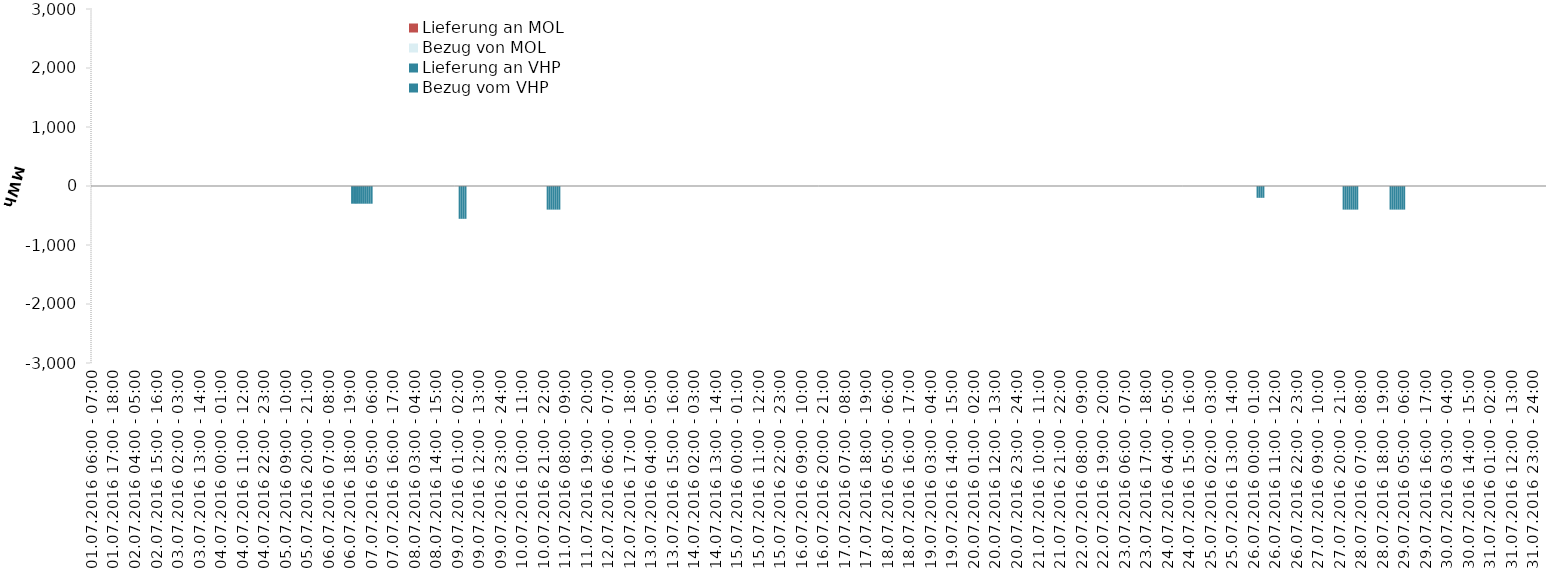
| Category | Bezug vom VHP | Lieferung an VHP | Bezug von MOL | Lieferung an MOL |
|---|---|---|---|---|
| 01.07.2016 06:00 - 07:00 | 0 | 0 | 0 | 0 |
| 01.07.2016 07:00 - 08:00 | 0 | 0 | 0 | 0 |
| 01.07.2016 08:00 - 09:00 | 0 | 0 | 0 | 0 |
| 01.07.2016 09:00 - 10:00 | 0 | 0 | 0 | 0 |
| 01.07.2016 10:00 - 11:00 | 0 | 0 | 0 | 0 |
| 01.07.2016 11:00 - 12:00 | 0 | 0 | 0 | 0 |
| 01.07.2016 12:00 - 13:00 | 0 | 0 | 0 | 0 |
| 01.07.2016 13:00 - 14:00 | 0 | 0 | 0 | 0 |
| 01.07.2016 14:00 - 15:00 | 0 | 0 | 0 | 0 |
| 01.07.2016 15:00 - 16:00 | 0 | 0 | 0 | 0 |
| 01.07.2016 16:00 - 17:00 | 0 | 0 | 0 | 0 |
| 01.07.2016 17:00 - 18:00 | 0 | 0 | 0 | 0 |
| 01.07.2016 18:00 - 19:00 | 0 | 0 | 0 | 0 |
| 01.07.2016 19:00 - 20:00 | 0 | 0 | 0 | 0 |
| 01.07.2016 20:00 - 21:00 | 0 | 0 | 0 | 0 |
| 01.07.2016 21:00 - 22:00 | 0 | 0 | 0 | 0 |
| 01.07.2016 22:00 - 23:00 | 0 | 0 | 0 | 0 |
| 01.07.2016 23:00 - 24:00 | 0 | 0 | 0 | 0 |
| 02.07.2016 00:00 - 01:00 | 0 | 0 | 0 | 0 |
| 02.07.2016 01:00 - 02:00 | 0 | 0 | 0 | 0 |
| 02.07.2016 02:00 - 03:00 | 0 | 0 | 0 | 0 |
| 02.07.2016 03:00 - 04:00 | 0 | 0 | 0 | 0 |
| 02.07.2016 04:00 - 05:00 | 0 | 0 | 0 | 0 |
| 02.07.2016 05:00 - 06:00 | 0 | 0 | 0 | 0 |
| 02.07.2016 06:00 - 07:00 | 0 | 0 | 0 | 0 |
| 02.07.2016 07:00 - 08:00 | 0 | 0 | 0 | 0 |
| 02.07.2016 08:00 - 09:00 | 0 | 0 | 0 | 0 |
| 02.07.2016 09:00 - 10:00 | 0 | 0 | 0 | 0 |
| 02.07.2016 10:00 - 11:00 | 0 | 0 | 0 | 0 |
| 02.07.2016 11:00 - 12:00 | 0 | 0 | 0 | 0 |
| 02.07.2016 12:00 - 13:00 | 0 | 0 | 0 | 0 |
| 02.07.2016 13:00 - 14:00 | 0 | 0 | 0 | 0 |
| 02.07.2016 14:00 - 15:00 | 0 | 0 | 0 | 0 |
| 02.07.2016 15:00 - 16:00 | 0 | 0 | 0 | 0 |
| 02.07.2016 16:00 - 17:00 | 0 | 0 | 0 | 0 |
| 02.07.2016 17:00 - 18:00 | 0 | 0 | 0 | 0 |
| 02.07.2016 18:00 - 19:00 | 0 | 0 | 0 | 0 |
| 02.07.2016 19:00 - 20:00 | 0 | 0 | 0 | 0 |
| 02.07.2016 20:00 - 21:00 | 0 | 0 | 0 | 0 |
| 02.07.2016 21:00 - 22:00 | 0 | 0 | 0 | 0 |
| 02.07.2016 22:00 - 23:00 | 0 | 0 | 0 | 0 |
| 02.07.2016 23:00 - 24:00 | 0 | 0 | 0 | 0 |
| 03.07.2016 00:00 - 01:00 | 0 | 0 | 0 | 0 |
| 03.07.2016 01:00 - 02:00 | 0 | 0 | 0 | 0 |
| 03.07.2016 02:00 - 03:00 | 0 | 0 | 0 | 0 |
| 03.07.2016 03:00 - 04:00 | 0 | 0 | 0 | 0 |
| 03.07.2016 04:00 - 05:00 | 0 | 0 | 0 | 0 |
| 03.07.2016 05:00 - 06:00 | 0 | 0 | 0 | 0 |
| 03.07.2016 06:00 - 07:00 | 0 | 0 | 0 | 0 |
| 03.07.2016 07:00 - 08:00 | 0 | 0 | 0 | 0 |
| 03.07.2016 08:00 - 09:00 | 0 | 0 | 0 | 0 |
| 03.07.2016 09:00 - 10:00 | 0 | 0 | 0 | 0 |
| 03.07.2016 10:00 - 11:00 | 0 | 0 | 0 | 0 |
| 03.07.2016 11:00 - 12:00 | 0 | 0 | 0 | 0 |
| 03.07.2016 12:00 - 13:00 | 0 | 0 | 0 | 0 |
| 03.07.2016 13:00 - 14:00 | 0 | 0 | 0 | 0 |
| 03.07.2016 14:00 - 15:00 | 0 | 0 | 0 | 0 |
| 03.07.2016 15:00 - 16:00 | 0 | 0 | 0 | 0 |
| 03.07.2016 16:00 - 17:00 | 0 | 0 | 0 | 0 |
| 03.07.2016 17:00 - 18:00 | 0 | 0 | 0 | 0 |
| 03.07.2016 18:00 - 19:00 | 0 | 0 | 0 | 0 |
| 03.07.2016 19:00 - 20:00 | 0 | 0 | 0 | 0 |
| 03.07.2016 20:00 - 21:00 | 0 | 0 | 0 | 0 |
| 03.07.2016 21:00 - 22:00 | 0 | 0 | 0 | 0 |
| 03.07.2016 22:00 - 23:00 | 0 | 0 | 0 | 0 |
| 03.07.2016 23:00 - 24:00 | 0 | 0 | 0 | 0 |
| 04.07.2016 00:00 - 01:00 | 0 | 0 | 0 | 0 |
| 04.07.2016 01:00 - 02:00 | 0 | 0 | 0 | 0 |
| 04.07.2016 02:00 - 03:00 | 0 | 0 | 0 | 0 |
| 04.07.2016 03:00 - 04:00 | 0 | 0 | 0 | 0 |
| 04.07.2016 04:00 - 05:00 | 0 | 0 | 0 | 0 |
| 04.07.2016 05:00 - 06:00 | 0 | 0 | 0 | 0 |
| 04.07.2016 06:00 - 07:00 | 0 | 0 | 0 | 0 |
| 04.07.2016 07:00 - 08:00 | 0 | 0 | 0 | 0 |
| 04.07.2016 08:00 - 09:00 | 0 | 0 | 0 | 0 |
| 04.07.2016 09:00 - 10:00 | 0 | 0 | 0 | 0 |
| 04.07.2016 10:00 - 11:00 | 0 | 0 | 0 | 0 |
| 04.07.2016 11:00 - 12:00 | 0 | 0 | 0 | 0 |
| 04.07.2016 12:00 - 13:00 | 0 | 0 | 0 | 0 |
| 04.07.2016 13:00 - 14:00 | 0 | 0 | 0 | 0 |
| 04.07.2016 14:00 - 15:00 | 0 | 0 | 0 | 0 |
| 04.07.2016 15:00 - 16:00 | 0 | 0 | 0 | 0 |
| 04.07.2016 16:00 - 17:00 | 0 | 0 | 0 | 0 |
| 04.07.2016 17:00 - 18:00 | 0 | 0 | 0 | 0 |
| 04.07.2016 18:00 - 19:00 | 0 | 0 | 0 | 0 |
| 04.07.2016 19:00 - 20:00 | 0 | 0 | 0 | 0 |
| 04.07.2016 20:00 - 21:00 | 0 | 0 | 0 | 0 |
| 04.07.2016 21:00 - 22:00 | 0 | 0 | 0 | 0 |
| 04.07.2016 22:00 - 23:00 | 0 | 0 | 0 | 0 |
| 04.07.2016 23:00 - 24:00 | 0 | 0 | 0 | 0 |
| 05.07.2016 00:00 - 01:00 | 0 | 0 | 0 | 0 |
| 05.07.2016 01:00 - 02:00 | 0 | 0 | 0 | 0 |
| 05.07.2016 02:00 - 03:00 | 0 | 0 | 0 | 0 |
| 05.07.2016 03:00 - 04:00 | 0 | 0 | 0 | 0 |
| 05.07.2016 04:00 - 05:00 | 0 | 0 | 0 | 0 |
| 05.07.2016 05:00 - 06:00 | 0 | 0 | 0 | 0 |
| 05.07.2016 06:00 - 07:00 | 0 | 0 | 0 | 0 |
| 05.07.2016 07:00 - 08:00 | 0 | 0 | 0 | 0 |
| 05.07.2016 08:00 - 09:00 | 0 | 0 | 0 | 0 |
| 05.07.2016 09:00 - 10:00 | 0 | 0 | 0 | 0 |
| 05.07.2016 10:00 - 11:00 | 0 | 0 | 0 | 0 |
| 05.07.2016 11:00 - 12:00 | 0 | 0 | 0 | 0 |
| 05.07.2016 12:00 - 13:00 | 0 | 0 | 0 | 0 |
| 05.07.2016 13:00 - 14:00 | 0 | 0 | 0 | 0 |
| 05.07.2016 14:00 - 15:00 | 0 | 0 | 0 | 0 |
| 05.07.2016 15:00 - 16:00 | 0 | 0 | 0 | 0 |
| 05.07.2016 16:00 - 17:00 | 0 | 0 | 0 | 0 |
| 05.07.2016 17:00 - 18:00 | 0 | 0 | 0 | 0 |
| 05.07.2016 18:00 - 19:00 | 0 | 0 | 0 | 0 |
| 05.07.2016 19:00 - 20:00 | 0 | 0 | 0 | 0 |
| 05.07.2016 20:00 - 21:00 | 0 | 0 | 0 | 0 |
| 05.07.2016 21:00 - 22:00 | 0 | 0 | 0 | 0 |
| 05.07.2016 22:00 - 23:00 | 0 | 0 | 0 | 0 |
| 05.07.2016 23:00 - 24:00 | 0 | 0 | 0 | 0 |
| 06.07.2016 00:00 - 01:00 | 0 | 0 | 0 | 0 |
| 06.07.2016 01:00 - 02:00 | 0 | 0 | 0 | 0 |
| 06.07.2016 02:00 - 03:00 | 0 | 0 | 0 | 0 |
| 06.07.2016 03:00 - 04:00 | 0 | 0 | 0 | 0 |
| 06.07.2016 04:00 - 05:00 | 0 | 0 | 0 | 0 |
| 06.07.2016 05:00 - 06:00 | 0 | 0 | 0 | 0 |
| 06.07.2016 06:00 - 07:00 | 0 | 0 | 0 | 0 |
| 06.07.2016 07:00 - 08:00 | 0 | 0 | 0 | 0 |
| 06.07.2016 08:00 - 09:00 | 0 | 0 | 0 | 0 |
| 06.07.2016 09:00 - 10:00 | 0 | 0 | 0 | 0 |
| 06.07.2016 10:00 - 11:00 | 0 | 0 | 0 | 0 |
| 06.07.2016 11:00 - 12:00 | 0 | 0 | 0 | 0 |
| 06.07.2016 12:00 - 13:00 | 0 | 0 | 0 | 0 |
| 06.07.2016 13:00 - 14:00 | 0 | 0 | 0 | 0 |
| 06.07.2016 14:00 - 15:00 | 0 | 0 | 0 | 0 |
| 06.07.2016 15:00 - 16:00 | 0 | 0 | 0 | 0 |
| 06.07.2016 16:00 - 17:00 | 0 | 0 | 0 | 0 |
| 06.07.2016 17:00 - 18:00 | 0 | 0 | 0 | 0 |
| 06.07.2016 18:00 - 19:00 | 0 | 0 | 0 | 0 |
| 06.07.2016 19:00 - 20:00 | 0 | -300 | 0 | 0 |
| 06.07.2016 20:00 - 21:00 | 0 | -300 | 0 | 0 |
| 06.07.2016 21:00 - 22:00 | 0 | -300 | 0 | 0 |
| 06.07.2016 22:00 - 23:00 | 0 | -300 | 0 | 0 |
| 06.07.2016 23:00 - 24:00 | 0 | -300 | 0 | 0 |
| 07.07.2016 00:00 - 01:00 | 0 | -300 | 0 | 0 |
| 07.07.2016 01:00 - 02:00 | 0 | -300 | 0 | 0 |
| 07.07.2016 02:00 - 03:00 | 0 | -300 | 0 | 0 |
| 07.07.2016 03:00 - 04:00 | 0 | -300 | 0 | 0 |
| 07.07.2016 04:00 - 05:00 | 0 | -300 | 0 | 0 |
| 07.07.2016 05:00 - 06:00 | 0 | -300 | 0 | 0 |
| 07.07.2016 06:00 - 07:00 | 0 | 0 | 0 | 0 |
| 07.07.2016 07:00 - 08:00 | 0 | 0 | 0 | 0 |
| 07.07.2016 08:00 - 09:00 | 0 | 0 | 0 | 0 |
| 07.07.2016 09:00 - 10:00 | 0 | 0 | 0 | 0 |
| 07.07.2016 10:00 - 11:00 | 0 | 0 | 0 | 0 |
| 07.07.2016 11:00 - 12:00 | 0 | 0 | 0 | 0 |
| 07.07.2016 12:00 - 13:00 | 0 | 0 | 0 | 0 |
| 07.07.2016 13:00 - 14:00 | 0 | 0 | 0 | 0 |
| 07.07.2016 14:00 - 15:00 | 0 | 0 | 0 | 0 |
| 07.07.2016 15:00 - 16:00 | 0 | 0 | 0 | 0 |
| 07.07.2016 16:00 - 17:00 | 0 | 0 | 0 | 0 |
| 07.07.2016 17:00 - 18:00 | 0 | 0 | 0 | 0 |
| 07.07.2016 18:00 - 19:00 | 0 | 0 | 0 | 0 |
| 07.07.2016 19:00 - 20:00 | 0 | 0 | 0 | 0 |
| 07.07.2016 20:00 - 21:00 | 0 | 0 | 0 | 0 |
| 07.07.2016 21:00 - 22:00 | 0 | 0 | 0 | 0 |
| 07.07.2016 22:00 - 23:00 | 0 | 0 | 0 | 0 |
| 07.07.2016 23:00 - 24:00 | 0 | 0 | 0 | 0 |
| 08.07.2016 00:00 - 01:00 | 0 | 0 | 0 | 0 |
| 08.07.2016 01:00 - 02:00 | 0 | 0 | 0 | 0 |
| 08.07.2016 02:00 - 03:00 | 0 | 0 | 0 | 0 |
| 08.07.2016 03:00 - 04:00 | 0 | 0 | 0 | 0 |
| 08.07.2016 04:00 - 05:00 | 0 | 0 | 0 | 0 |
| 08.07.2016 05:00 - 06:00 | 0 | 0 | 0 | 0 |
| 08.07.2016 06:00 - 07:00 | 0 | 0 | 0 | 0 |
| 08.07.2016 07:00 - 08:00 | 0 | 0 | 0 | 0 |
| 08.07.2016 08:00 - 09:00 | 0 | 0 | 0 | 0 |
| 08.07.2016 09:00 - 10:00 | 0 | 0 | 0 | 0 |
| 08.07.2016 10:00 - 11:00 | 0 | 0 | 0 | 0 |
| 08.07.2016 11:00 - 12:00 | 0 | 0 | 0 | 0 |
| 08.07.2016 12:00 - 13:00 | 0 | 0 | 0 | 0 |
| 08.07.2016 13:00 - 14:00 | 0 | 0 | 0 | 0 |
| 08.07.2016 14:00 - 15:00 | 0 | 0 | 0 | 0 |
| 08.07.2016 15:00 - 16:00 | 0 | 0 | 0 | 0 |
| 08.07.2016 16:00 - 17:00 | 0 | 0 | 0 | 0 |
| 08.07.2016 17:00 - 18:00 | 0 | 0 | 0 | 0 |
| 08.07.2016 18:00 - 19:00 | 0 | 0 | 0 | 0 |
| 08.07.2016 19:00 - 20:00 | 0 | 0 | 0 | 0 |
| 08.07.2016 20:00 - 21:00 | 0 | 0 | 0 | 0 |
| 08.07.2016 21:00 - 22:00 | 0 | 0 | 0 | 0 |
| 08.07.2016 22:00 - 23:00 | 0 | 0 | 0 | 0 |
| 08.07.2016 23:00 - 24:00 | 0 | 0 | 0 | 0 |
| 09.07.2016 00:00 - 01:00 | 0 | 0 | 0 | 0 |
| 09.07.2016 01:00 - 02:00 | 0 | 0 | 0 | 0 |
| 09.07.2016 02:00 - 03:00 | 0 | -556 | 0 | 0 |
| 09.07.2016 03:00 - 04:00 | 0 | -556 | 0 | 0 |
| 09.07.2016 04:00 - 05:00 | 0 | -556 | 0 | 0 |
| 09.07.2016 05:00 - 06:00 | 0 | -556 | 0 | 0 |
| 09.07.2016 06:00 - 07:00 | 0 | 0 | 0 | 0 |
| 09.07.2016 07:00 - 08:00 | 0 | 0 | 0 | 0 |
| 09.07.2016 08:00 - 09:00 | 0 | 0 | 0 | 0 |
| 09.07.2016 09:00 - 10:00 | 0 | 0 | 0 | 0 |
| 09.07.2016 10:00 - 11:00 | 0 | 0 | 0 | 0 |
| 09.07.2016 11:00 - 12:00 | 0 | 0 | 0 | 0 |
| 09.07.2016 12:00 - 13:00 | 0 | 0 | 0 | 0 |
| 09.07.2016 13:00 - 14:00 | 0 | 0 | 0 | 0 |
| 09.07.2016 14:00 - 15:00 | 0 | 0 | 0 | 0 |
| 09.07.2016 15:00 - 16:00 | 0 | 0 | 0 | 0 |
| 09.07.2016 16:00 - 17:00 | 0 | 0 | 0 | 0 |
| 09.07.2016 17:00 - 18:00 | 0 | 0 | 0 | 0 |
| 09.07.2016 18:00 - 19:00 | 0 | 0 | 0 | 0 |
| 09.07.2016 19:00 - 20:00 | 0 | 0 | 0 | 0 |
| 09.07.2016 20:00 - 21:00 | 0 | 0 | 0 | 0 |
| 09.07.2016 21:00 - 22:00 | 0 | 0 | 0 | 0 |
| 09.07.2016 22:00 - 23:00 | 0 | 0 | 0 | 0 |
| 09.07.2016 23:00 - 24:00 | 0 | 0 | 0 | 0 |
| 10.07.2016 00:00 - 01:00 | 0 | 0 | 0 | 0 |
| 10.07.2016 01:00 - 02:00 | 0 | 0 | 0 | 0 |
| 10.07.2016 02:00 - 03:00 | 0 | 0 | 0 | 0 |
| 10.07.2016 03:00 - 04:00 | 0 | 0 | 0 | 0 |
| 10.07.2016 04:00 - 05:00 | 0 | 0 | 0 | 0 |
| 10.07.2016 05:00 - 06:00 | 0 | 0 | 0 | 0 |
| 10.07.2016 06:00 - 07:00 | 0 | 0 | 0 | 0 |
| 10.07.2016 07:00 - 08:00 | 0 | 0 | 0 | 0 |
| 10.07.2016 08:00 - 09:00 | 0 | 0 | 0 | 0 |
| 10.07.2016 09:00 - 10:00 | 0 | 0 | 0 | 0 |
| 10.07.2016 10:00 - 11:00 | 0 | 0 | 0 | 0 |
| 10.07.2016 11:00 - 12:00 | 0 | 0 | 0 | 0 |
| 10.07.2016 12:00 - 13:00 | 0 | 0 | 0 | 0 |
| 10.07.2016 13:00 - 14:00 | 0 | 0 | 0 | 0 |
| 10.07.2016 14:00 - 15:00 | 0 | 0 | 0 | 0 |
| 10.07.2016 15:00 - 16:00 | 0 | 0 | 0 | 0 |
| 10.07.2016 16:00 - 17:00 | 0 | 0 | 0 | 0 |
| 10.07.2016 17:00 - 18:00 | 0 | 0 | 0 | 0 |
| 10.07.2016 18:00 - 19:00 | 0 | 0 | 0 | 0 |
| 10.07.2016 19:00 - 20:00 | 0 | 0 | 0 | 0 |
| 10.07.2016 20:00 - 21:00 | 0 | 0 | 0 | 0 |
| 10.07.2016 21:00 - 22:00 | 0 | 0 | 0 | 0 |
| 10.07.2016 22:00 - 23:00 | 0 | 0 | 0 | 0 |
| 10.07.2016 23:00 - 24:00 | 0 | -400 | 0 | 0 |
| 11.07.2016 00:00 - 01:00 | 0 | -400 | 0 | 0 |
| 11.07.2016 01:00 - 02:00 | 0 | -400 | 0 | 0 |
| 11.07.2016 02:00 - 03:00 | 0 | -400 | 0 | 0 |
| 11.07.2016 03:00 - 04:00 | 0 | -400 | 0 | 0 |
| 11.07.2016 04:00 - 05:00 | 0 | -400 | 0 | 0 |
| 11.07.2016 05:00 - 06:00 | 0 | -400 | 0 | 0 |
| 11.07.2016 06:00 - 07:00 | 0 | 0 | 0 | 0 |
| 11.07.2016 07:00 - 08:00 | 0 | 0 | 0 | 0 |
| 11.07.2016 08:00 - 09:00 | 0 | 0 | 0 | 0 |
| 11.07.2016 09:00 - 10:00 | 0 | 0 | 0 | 0 |
| 11.07.2016 10:00 - 11:00 | 0 | 0 | 0 | 0 |
| 11.07.2016 11:00 - 12:00 | 0 | 0 | 0 | 0 |
| 11.07.2016 12:00 - 13:00 | 0 | 0 | 0 | 0 |
| 11.07.2016 13:00 - 14:00 | 0 | 0 | 0 | 0 |
| 11.07.2016 14:00 - 15:00 | 0 | 0 | 0 | 0 |
| 11.07.2016 15:00 - 16:00 | 0 | 0 | 0 | 0 |
| 11.07.2016 16:00 - 17:00 | 0 | 0 | 0 | 0 |
| 11.07.2016 17:00 - 18:00 | 0 | 0 | 0 | 0 |
| 11.07.2016 18:00 - 19:00 | 0 | 0 | 0 | 0 |
| 11.07.2016 19:00 - 20:00 | 0 | 0 | 0 | 0 |
| 11.07.2016 20:00 - 21:00 | 0 | 0 | 0 | 0 |
| 11.07.2016 21:00 - 22:00 | 0 | 0 | 0 | 0 |
| 11.07.2016 22:00 - 23:00 | 0 | 0 | 0 | 0 |
| 11.07.2016 23:00 - 24:00 | 0 | 0 | 0 | 0 |
| 12.07.2016 00:00 - 01:00 | 0 | 0 | 0 | 0 |
| 12.07.2016 01:00 - 02:00 | 0 | 0 | 0 | 0 |
| 12.07.2016 02:00 - 03:00 | 0 | 0 | 0 | 0 |
| 12.07.2016 03:00 - 04:00 | 0 | 0 | 0 | 0 |
| 12.07.2016 04:00 - 05:00 | 0 | 0 | 0 | 0 |
| 12.07.2016 05:00 - 06:00 | 0 | 0 | 0 | 0 |
| 12.07.2016 06:00 - 07:00 | 0 | 0 | 0 | 0 |
| 12.07.2016 07:00 - 08:00 | 0 | 0 | 0 | 0 |
| 12.07.2016 08:00 - 09:00 | 0 | 0 | 0 | 0 |
| 12.07.2016 09:00 - 10:00 | 0 | 0 | 0 | 0 |
| 12.07.2016 10:00 - 11:00 | 0 | 0 | 0 | 0 |
| 12.07.2016 11:00 - 12:00 | 0 | 0 | 0 | 0 |
| 12.07.2016 12:00 - 13:00 | 0 | 0 | 0 | 0 |
| 12.07.2016 13:00 - 14:00 | 0 | 0 | 0 | 0 |
| 12.07.2016 14:00 - 15:00 | 0 | 0 | 0 | 0 |
| 12.07.2016 15:00 - 16:00 | 0 | 0 | 0 | 0 |
| 12.07.2016 16:00 - 17:00 | 0 | 0 | 0 | 0 |
| 12.07.2016 17:00 - 18:00 | 0 | 0 | 0 | 0 |
| 12.07.2016 18:00 - 19:00 | 0 | 0 | 0 | 0 |
| 12.07.2016 19:00 - 20:00 | 0 | 0 | 0 | 0 |
| 12.07.2016 20:00 - 21:00 | 0 | 0 | 0 | 0 |
| 12.07.2016 21:00 - 22:00 | 0 | 0 | 0 | 0 |
| 12.07.2016 22:00 - 23:00 | 0 | 0 | 0 | 0 |
| 12.07.2016 23:00 - 24:00 | 0 | 0 | 0 | 0 |
| 13.07.2016 00:00 - 01:00 | 0 | 0 | 0 | 0 |
| 13.07.2016 01:00 - 02:00 | 0 | 0 | 0 | 0 |
| 13.07.2016 02:00 - 03:00 | 0 | 0 | 0 | 0 |
| 13.07.2016 03:00 - 04:00 | 0 | 0 | 0 | 0 |
| 13.07.2016 04:00 - 05:00 | 0 | 0 | 0 | 0 |
| 13.07.2016 05:00 - 06:00 | 0 | 0 | 0 | 0 |
| 13.07.2016 06:00 - 07:00 | 0 | 0 | 0 | 0 |
| 13.07.2016 07:00 - 08:00 | 0 | 0 | 0 | 0 |
| 13.07.2016 08:00 - 09:00 | 0 | 0 | 0 | 0 |
| 13.07.2016 09:00 - 10:00 | 0 | 0 | 0 | 0 |
| 13.07.2016 10:00 - 11:00 | 0 | 0 | 0 | 0 |
| 13.07.2016 11:00 - 12:00 | 0 | 0 | 0 | 0 |
| 13.07.2016 12:00 - 13:00 | 0 | 0 | 0 | 0 |
| 13.07.2016 13:00 - 14:00 | 0 | 0 | 0 | 0 |
| 13.07.2016 14:00 - 15:00 | 0 | 0 | 0 | 0 |
| 13.07.2016 15:00 - 16:00 | 0 | 0 | 0 | 0 |
| 13.07.2016 16:00 - 17:00 | 0 | 0 | 0 | 0 |
| 13.07.2016 17:00 - 18:00 | 0 | 0 | 0 | 0 |
| 13.07.2016 18:00 - 19:00 | 0 | 0 | 0 | 0 |
| 13.07.2016 19:00 - 20:00 | 0 | 0 | 0 | 0 |
| 13.07.2016 20:00 - 21:00 | 0 | 0 | 0 | 0 |
| 13.07.2016 21:00 - 22:00 | 0 | 0 | 0 | 0 |
| 13.07.2016 22:00 - 23:00 | 0 | 0 | 0 | 0 |
| 13.07.2016 23:00 - 24:00 | 0 | 0 | 0 | 0 |
| 14.07.2016 00:00 - 01:00 | 0 | 0 | 0 | 0 |
| 14.07.2016 01:00 - 02:00 | 0 | 0 | 0 | 0 |
| 14.07.2016 02:00 - 03:00 | 0 | 0 | 0 | 0 |
| 14.07.2016 03:00 - 04:00 | 0 | 0 | 0 | 0 |
| 14.07.2016 04:00 - 05:00 | 0 | 0 | 0 | 0 |
| 14.07.2016 05:00 - 06:00 | 0 | 0 | 0 | 0 |
| 14.07.2016 06:00 - 07:00 | 0 | 0 | 0 | 0 |
| 14.07.2016 07:00 - 08:00 | 0 | 0 | 0 | 0 |
| 14.07.2016 08:00 - 09:00 | 0 | 0 | 0 | 0 |
| 14.07.2016 09:00 - 10:00 | 0 | 0 | 0 | 0 |
| 14.07.2016 10:00 - 11:00 | 0 | 0 | 0 | 0 |
| 14.07.2016 11:00 - 12:00 | 0 | 0 | 0 | 0 |
| 14.07.2016 12:00 - 13:00 | 0 | 0 | 0 | 0 |
| 14.07.2016 13:00 - 14:00 | 0 | 0 | 0 | 0 |
| 14.07.2016 14:00 - 15:00 | 0 | 0 | 0 | 0 |
| 14.07.2016 15:00 - 16:00 | 0 | 0 | 0 | 0 |
| 14.07.2016 16:00 - 17:00 | 0 | 0 | 0 | 0 |
| 14.07.2016 17:00 - 18:00 | 0 | 0 | 0 | 0 |
| 14.07.2016 18:00 - 19:00 | 0 | 0 | 0 | 0 |
| 14.07.2016 19:00 - 20:00 | 0 | 0 | 0 | 0 |
| 14.07.2016 20:00 - 21:00 | 0 | 0 | 0 | 0 |
| 14.07.2016 21:00 - 22:00 | 0 | 0 | 0 | 0 |
| 14.07.2016 22:00 - 23:00 | 0 | 0 | 0 | 0 |
| 14.07.2016 23:00 - 24:00 | 0 | 0 | 0 | 0 |
| 15.07.2016 00:00 - 01:00 | 0 | 0 | 0 | 0 |
| 15.07.2016 01:00 - 02:00 | 0 | 0 | 0 | 0 |
| 15.07.2016 02:00 - 03:00 | 0 | 0 | 0 | 0 |
| 15.07.2016 03:00 - 04:00 | 0 | 0 | 0 | 0 |
| 15.07.2016 04:00 - 05:00 | 0 | 0 | 0 | 0 |
| 15.07.2016 05:00 - 06:00 | 0 | 0 | 0 | 0 |
| 15.07.2016 06:00 - 07:00 | 0 | 0 | 0 | 0 |
| 15.07.2016 07:00 - 08:00 | 0 | 0 | 0 | 0 |
| 15.07.2016 08:00 - 09:00 | 0 | 0 | 0 | 0 |
| 15.07.2016 09:00 - 10:00 | 0 | 0 | 0 | 0 |
| 15.07.2016 10:00 - 11:00 | 0 | 0 | 0 | 0 |
| 15.07.2016 11:00 - 12:00 | 0 | 0 | 0 | 0 |
| 15.07.2016 12:00 - 13:00 | 0 | 0 | 0 | 0 |
| 15.07.2016 13:00 - 14:00 | 0 | 0 | 0 | 0 |
| 15.07.2016 14:00 - 15:00 | 0 | 0 | 0 | 0 |
| 15.07.2016 15:00 - 16:00 | 0 | 0 | 0 | 0 |
| 15.07.2016 16:00 - 17:00 | 0 | 0 | 0 | 0 |
| 15.07.2016 17:00 - 18:00 | 0 | 0 | 0 | 0 |
| 15.07.2016 18:00 - 19:00 | 0 | 0 | 0 | 0 |
| 15.07.2016 19:00 - 20:00 | 0 | 0 | 0 | 0 |
| 15.07.2016 20:00 - 21:00 | 0 | 0 | 0 | 0 |
| 15.07.2016 21:00 - 22:00 | 0 | 0 | 0 | 0 |
| 15.07.2016 22:00 - 23:00 | 0 | 0 | 0 | 0 |
| 15.07.2016 23:00 - 24:00 | 0 | 0 | 0 | 0 |
| 16.07.2016 00:00 - 01:00 | 0 | 0 | 0 | 0 |
| 16.07.2016 01:00 - 02:00 | 0 | 0 | 0 | 0 |
| 16.07.2016 02:00 - 03:00 | 0 | 0 | 0 | 0 |
| 16.07.2016 03:00 - 04:00 | 0 | 0 | 0 | 0 |
| 16.07.2016 04:00 - 05:00 | 0 | 0 | 0 | 0 |
| 16.07.2016 05:00 - 06:00 | 0 | 0 | 0 | 0 |
| 16.07.2016 06:00 - 07:00 | 0 | 0 | 0 | 0 |
| 16.07.2016 07:00 - 08:00 | 0 | 0 | 0 | 0 |
| 16.07.2016 08:00 - 09:00 | 0 | 0 | 0 | 0 |
| 16.07.2016 09:00 - 10:00 | 0 | 0 | 0 | 0 |
| 16.07.2016 10:00 - 11:00 | 0 | 0 | 0 | 0 |
| 16.07.2016 11:00 - 12:00 | 0 | 0 | 0 | 0 |
| 16.07.2016 12:00 - 13:00 | 0 | 0 | 0 | 0 |
| 16.07.2016 13:00 - 14:00 | 0 | 0 | 0 | 0 |
| 16.07.2016 14:00 - 15:00 | 0 | 0 | 0 | 0 |
| 16.07.2016 15:00 - 16:00 | 0 | 0 | 0 | 0 |
| 16.07.2016 16:00 - 17:00 | 0 | 0 | 0 | 0 |
| 16.07.2016 17:00 - 18:00 | 0 | 0 | 0 | 0 |
| 16.07.2016 18:00 - 19:00 | 0 | 0 | 0 | 0 |
| 16.07.2016 19:00 - 20:00 | 0 | 0 | 0 | 0 |
| 16.07.2016 20:00 - 21:00 | 0 | 0 | 0 | 0 |
| 16.07.2016 21:00 - 22:00 | 0 | 0 | 0 | 0 |
| 16.07.2016 22:00 - 23:00 | 0 | 0 | 0 | 0 |
| 16.07.2016 23:00 - 24:00 | 0 | 0 | 0 | 0 |
| 17.07.2016 00:00 - 01:00 | 0 | 0 | 0 | 0 |
| 17.07.2016 01:00 - 02:00 | 0 | 0 | 0 | 0 |
| 17.07.2016 02:00 - 03:00 | 0 | 0 | 0 | 0 |
| 17.07.2016 03:00 - 04:00 | 0 | 0 | 0 | 0 |
| 17.07.2016 04:00 - 05:00 | 0 | 0 | 0 | 0 |
| 17.07.2016 05:00 - 06:00 | 0 | 0 | 0 | 0 |
| 17.07.2016 06:00 - 07:00 | 0 | 0 | 0 | 0 |
| 17.07.2016 07:00 - 08:00 | 0 | 0 | 0 | 0 |
| 17.07.2016 08:00 - 09:00 | 0 | 0 | 0 | 0 |
| 17.07.2016 09:00 - 10:00 | 0 | 0 | 0 | 0 |
| 17.07.2016 10:00 - 11:00 | 0 | 0 | 0 | 0 |
| 17.07.2016 11:00 - 12:00 | 0 | 0 | 0 | 0 |
| 17.07.2016 12:00 - 13:00 | 0 | 0 | 0 | 0 |
| 17.07.2016 13:00 - 14:00 | 0 | 0 | 0 | 0 |
| 17.07.2016 14:00 - 15:00 | 0 | 0 | 0 | 0 |
| 17.07.2016 15:00 - 16:00 | 0 | 0 | 0 | 0 |
| 17.07.2016 16:00 - 17:00 | 0 | 0 | 0 | 0 |
| 17.07.2016 17:00 - 18:00 | 0 | 0 | 0 | 0 |
| 17.07.2016 18:00 - 19:00 | 0 | 0 | 0 | 0 |
| 17.07.2016 19:00 - 20:00 | 0 | 0 | 0 | 0 |
| 17.07.2016 20:00 - 21:00 | 0 | 0 | 0 | 0 |
| 17.07.2016 21:00 - 22:00 | 0 | 0 | 0 | 0 |
| 17.07.2016 22:00 - 23:00 | 0 | 0 | 0 | 0 |
| 17.07.2016 23:00 - 24:00 | 0 | 0 | 0 | 0 |
| 18.07.2016 00:00 - 01:00 | 0 | 0 | 0 | 0 |
| 18.07.2016 01:00 - 02:00 | 0 | 0 | 0 | 0 |
| 18.07.2016 02:00 - 03:00 | 0 | 0 | 0 | 0 |
| 18.07.2016 03:00 - 04:00 | 0 | 0 | 0 | 0 |
| 18.07.2016 04:00 - 05:00 | 0 | 0 | 0 | 0 |
| 18.07.2016 05:00 - 06:00 | 0 | 0 | 0 | 0 |
| 18.07.2016 06:00 - 07:00 | 0 | 0 | 0 | 0 |
| 18.07.2016 07:00 - 08:00 | 0 | 0 | 0 | 0 |
| 18.07.2016 08:00 - 09:00 | 0 | 0 | 0 | 0 |
| 18.07.2016 09:00 - 10:00 | 0 | 0 | 0 | 0 |
| 18.07.2016 10:00 - 11:00 | 0 | 0 | 0 | 0 |
| 18.07.2016 11:00 - 12:00 | 0 | 0 | 0 | 0 |
| 18.07.2016 12:00 - 13:00 | 0 | 0 | 0 | 0 |
| 18.07.2016 13:00 - 14:00 | 0 | 0 | 0 | 0 |
| 18.07.2016 14:00 - 15:00 | 0 | 0 | 0 | 0 |
| 18.07.2016 15:00 - 16:00 | 0 | 0 | 0 | 0 |
| 18.07.2016 16:00 - 17:00 | 0 | 0 | 0 | 0 |
| 18.07.2016 17:00 - 18:00 | 0 | 0 | 0 | 0 |
| 18.07.2016 18:00 - 19:00 | 0 | 0 | 0 | 0 |
| 18.07.2016 19:00 - 20:00 | 0 | 0 | 0 | 0 |
| 18.07.2016 20:00 - 21:00 | 0 | 0 | 0 | 0 |
| 18.07.2016 21:00 - 22:00 | 0 | 0 | 0 | 0 |
| 18.07.2016 22:00 - 23:00 | 0 | 0 | 0 | 0 |
| 18.07.2016 23:00 - 24:00 | 0 | 0 | 0 | 0 |
| 19.07.2016 00:00 - 01:00 | 0 | 0 | 0 | 0 |
| 19.07.2016 01:00 - 02:00 | 0 | 0 | 0 | 0 |
| 19.07.2016 02:00 - 03:00 | 0 | 0 | 0 | 0 |
| 19.07.2016 03:00 - 04:00 | 0 | 0 | 0 | 0 |
| 19.07.2016 04:00 - 05:00 | 0 | 0 | 0 | 0 |
| 19.07.2016 05:00 - 06:00 | 0 | 0 | 0 | 0 |
| 19.07.2016 06:00 - 07:00 | 0 | 0 | 0 | 0 |
| 19.07.2016 07:00 - 08:00 | 0 | 0 | 0 | 0 |
| 19.07.2016 08:00 - 09:00 | 0 | 0 | 0 | 0 |
| 19.07.2016 09:00 - 10:00 | 0 | 0 | 0 | 0 |
| 19.07.2016 10:00 - 11:00 | 0 | 0 | 0 | 0 |
| 19.07.2016 11:00 - 12:00 | 0 | 0 | 0 | 0 |
| 19.07.2016 12:00 - 13:00 | 0 | 0 | 0 | 0 |
| 19.07.2016 13:00 - 14:00 | 0 | 0 | 0 | 0 |
| 19.07.2016 14:00 - 15:00 | 0 | 0 | 0 | 0 |
| 19.07.2016 15:00 - 16:00 | 0 | 0 | 0 | 0 |
| 19.07.2016 16:00 - 17:00 | 0 | 0 | 0 | 0 |
| 19.07.2016 17:00 - 18:00 | 0 | 0 | 0 | 0 |
| 19.07.2016 18:00 - 19:00 | 0 | 0 | 0 | 0 |
| 19.07.2016 19:00 - 20:00 | 0 | 0 | 0 | 0 |
| 19.07.2016 20:00 - 21:00 | 0 | 0 | 0 | 0 |
| 19.07.2016 21:00 - 22:00 | 0 | 0 | 0 | 0 |
| 19.07.2016 22:00 - 23:00 | 0 | 0 | 0 | 0 |
| 19.07.2016 23:00 - 24:00 | 0 | 0 | 0 | 0 |
| 20.07.2016 00:00 - 01:00 | 0 | 0 | 0 | 0 |
| 20.07.2016 01:00 - 02:00 | 0 | 0 | 0 | 0 |
| 20.07.2016 02:00 - 03:00 | 0 | 0 | 0 | 0 |
| 20.07.2016 03:00 - 04:00 | 0 | 0 | 0 | 0 |
| 20.07.2016 04:00 - 05:00 | 0 | 0 | 0 | 0 |
| 20.07.2016 05:00 - 06:00 | 0 | 0 | 0 | 0 |
| 20.07.2016 06:00 - 07:00 | 0 | 0 | 0 | 0 |
| 20.07.2016 07:00 - 08:00 | 0 | 0 | 0 | 0 |
| 20.07.2016 08:00 - 09:00 | 0 | 0 | 0 | 0 |
| 20.07.2016 09:00 - 10:00 | 0 | 0 | 0 | 0 |
| 20.07.2016 10:00 - 11:00 | 0 | 0 | 0 | 0 |
| 20.07.2016 11:00 - 12:00 | 0 | 0 | 0 | 0 |
| 20.07.2016 12:00 - 13:00 | 0 | 0 | 0 | 0 |
| 20.07.2016 13:00 - 14:00 | 0 | 0 | 0 | 0 |
| 20.07.2016 14:00 - 15:00 | 0 | 0 | 0 | 0 |
| 20.07.2016 15:00 - 16:00 | 0 | 0 | 0 | 0 |
| 20.07.2016 16:00 - 17:00 | 0 | 0 | 0 | 0 |
| 20.07.2016 17:00 - 18:00 | 0 | 0 | 0 | 0 |
| 20.07.2016 18:00 - 19:00 | 0 | 0 | 0 | 0 |
| 20.07.2016 19:00 - 20:00 | 0 | 0 | 0 | 0 |
| 20.07.2016 20:00 - 21:00 | 0 | 0 | 0 | 0 |
| 20.07.2016 21:00 - 22:00 | 0 | 0 | 0 | 0 |
| 20.07.2016 22:00 - 23:00 | 0 | 0 | 0 | 0 |
| 20.07.2016 23:00 - 24:00 | 0 | 0 | 0 | 0 |
| 21.07.2016 00:00 - 01:00 | 0 | 0 | 0 | 0 |
| 21.07.2016 01:00 - 02:00 | 0 | 0 | 0 | 0 |
| 21.07.2016 02:00 - 03:00 | 0 | 0 | 0 | 0 |
| 21.07.2016 03:00 - 04:00 | 0 | 0 | 0 | 0 |
| 21.07.2016 04:00 - 05:00 | 0 | 0 | 0 | 0 |
| 21.07.2016 05:00 - 06:00 | 0 | 0 | 0 | 0 |
| 21.07.2016 06:00 - 07:00 | 0 | 0 | 0 | 0 |
| 21.07.2016 07:00 - 08:00 | 0 | 0 | 0 | 0 |
| 21.07.2016 08:00 - 09:00 | 0 | 0 | 0 | 0 |
| 21.07.2016 09:00 - 10:00 | 0 | 0 | 0 | 0 |
| 21.07.2016 10:00 - 11:00 | 0 | 0 | 0 | 0 |
| 21.07.2016 11:00 - 12:00 | 0 | 0 | 0 | 0 |
| 21.07.2016 12:00 - 13:00 | 0 | 0 | 0 | 0 |
| 21.07.2016 13:00 - 14:00 | 0 | 0 | 0 | 0 |
| 21.07.2016 14:00 - 15:00 | 0 | 0 | 0 | 0 |
| 21.07.2016 15:00 - 16:00 | 0 | 0 | 0 | 0 |
| 21.07.2016 16:00 - 17:00 | 0 | 0 | 0 | 0 |
| 21.07.2016 17:00 - 18:00 | 0 | 0 | 0 | 0 |
| 21.07.2016 18:00 - 19:00 | 0 | 0 | 0 | 0 |
| 21.07.2016 19:00 - 20:00 | 0 | 0 | 0 | 0 |
| 21.07.2016 20:00 - 21:00 | 0 | 0 | 0 | 0 |
| 21.07.2016 21:00 - 22:00 | 0 | 0 | 0 | 0 |
| 21.07.2016 22:00 - 23:00 | 0 | 0 | 0 | 0 |
| 21.07.2016 23:00 - 24:00 | 0 | 0 | 0 | 0 |
| 22.07.2016 00:00 - 01:00 | 0 | 0 | 0 | 0 |
| 22.07.2016 01:00 - 02:00 | 0 | 0 | 0 | 0 |
| 22.07.2016 02:00 - 03:00 | 0 | 0 | 0 | 0 |
| 22.07.2016 03:00 - 04:00 | 0 | 0 | 0 | 0 |
| 22.07.2016 04:00 - 05:00 | 0 | 0 | 0 | 0 |
| 22.07.2016 05:00 - 06:00 | 0 | 0 | 0 | 0 |
| 22.07.2016 06:00 - 07:00 | 0 | 0 | 0 | 0 |
| 22.07.2016 07:00 - 08:00 | 0 | 0 | 0 | 0 |
| 22.07.2016 08:00 - 09:00 | 0 | 0 | 0 | 0 |
| 22.07.2016 09:00 - 10:00 | 0 | 0 | 0 | 0 |
| 22.07.2016 10:00 - 11:00 | 0 | 0 | 0 | 0 |
| 22.07.2016 11:00 - 12:00 | 0 | 0 | 0 | 0 |
| 22.07.2016 12:00 - 13:00 | 0 | 0 | 0 | 0 |
| 22.07.2016 13:00 - 14:00 | 0 | 0 | 0 | 0 |
| 22.07.2016 14:00 - 15:00 | 0 | 0 | 0 | 0 |
| 22.07.2016 15:00 - 16:00 | 0 | 0 | 0 | 0 |
| 22.07.2016 16:00 - 17:00 | 0 | 0 | 0 | 0 |
| 22.07.2016 17:00 - 18:00 | 0 | 0 | 0 | 0 |
| 22.07.2016 18:00 - 19:00 | 0 | 0 | 0 | 0 |
| 22.07.2016 19:00 - 20:00 | 0 | 0 | 0 | 0 |
| 22.07.2016 20:00 - 21:00 | 0 | 0 | 0 | 0 |
| 22.07.2016 21:00 - 22:00 | 0 | 0 | 0 | 0 |
| 22.07.2016 22:00 - 23:00 | 0 | 0 | 0 | 0 |
| 22.07.2016 23:00 - 24:00 | 0 | 0 | 0 | 0 |
| 23.07.2016 00:00 - 01:00 | 0 | 0 | 0 | 0 |
| 23.07.2016 01:00 - 02:00 | 0 | 0 | 0 | 0 |
| 23.07.2016 02:00 - 03:00 | 0 | 0 | 0 | 0 |
| 23.07.2016 03:00 - 04:00 | 0 | 0 | 0 | 0 |
| 23.07.2016 04:00 - 05:00 | 0 | 0 | 0 | 0 |
| 23.07.2016 05:00 - 06:00 | 0 | 0 | 0 | 0 |
| 23.07.2016 06:00 - 07:00 | 0 | 0 | 0 | 0 |
| 23.07.2016 07:00 - 08:00 | 0 | 0 | 0 | 0 |
| 23.07.2016 08:00 - 09:00 | 0 | 0 | 0 | 0 |
| 23.07.2016 09:00 - 10:00 | 0 | 0 | 0 | 0 |
| 23.07.2016 10:00 - 11:00 | 0 | 0 | 0 | 0 |
| 23.07.2016 11:00 - 12:00 | 0 | 0 | 0 | 0 |
| 23.07.2016 12:00 - 13:00 | 0 | 0 | 0 | 0 |
| 23.07.2016 13:00 - 14:00 | 0 | 0 | 0 | 0 |
| 23.07.2016 14:00 - 15:00 | 0 | 0 | 0 | 0 |
| 23.07.2016 15:00 - 16:00 | 0 | 0 | 0 | 0 |
| 23.07.2016 16:00 - 17:00 | 0 | 0 | 0 | 0 |
| 23.07.2016 17:00 - 18:00 | 0 | 0 | 0 | 0 |
| 23.07.2016 18:00 - 19:00 | 0 | 0 | 0 | 0 |
| 23.07.2016 19:00 - 20:00 | 0 | 0 | 0 | 0 |
| 23.07.2016 20:00 - 21:00 | 0 | 0 | 0 | 0 |
| 23.07.2016 21:00 - 22:00 | 0 | 0 | 0 | 0 |
| 23.07.2016 22:00 - 23:00 | 0 | 0 | 0 | 0 |
| 23.07.2016 23:00 - 24:00 | 0 | 0 | 0 | 0 |
| 24.07.2016 00:00 - 01:00 | 0 | 0 | 0 | 0 |
| 24.07.2016 01:00 - 02:00 | 0 | 0 | 0 | 0 |
| 24.07.2016 02:00 - 03:00 | 0 | 0 | 0 | 0 |
| 24.07.2016 03:00 - 04:00 | 0 | 0 | 0 | 0 |
| 24.07.2016 04:00 - 05:00 | 0 | 0 | 0 | 0 |
| 24.07.2016 05:00 - 06:00 | 0 | 0 | 0 | 0 |
| 24.07.2016 06:00 - 07:00 | 0 | 0 | 0 | 0 |
| 24.07.2016 07:00 - 08:00 | 0 | 0 | 0 | 0 |
| 24.07.2016 08:00 - 09:00 | 0 | 0 | 0 | 0 |
| 24.07.2016 09:00 - 10:00 | 0 | 0 | 0 | 0 |
| 24.07.2016 10:00 - 11:00 | 0 | 0 | 0 | 0 |
| 24.07.2016 11:00 - 12:00 | 0 | 0 | 0 | 0 |
| 24.07.2016 12:00 - 13:00 | 0 | 0 | 0 | 0 |
| 24.07.2016 13:00 - 14:00 | 0 | 0 | 0 | 0 |
| 24.07.2016 14:00 - 15:00 | 0 | 0 | 0 | 0 |
| 24.07.2016 15:00 - 16:00 | 0 | 0 | 0 | 0 |
| 24.07.2016 16:00 - 17:00 | 0 | 0 | 0 | 0 |
| 24.07.2016 17:00 - 18:00 | 0 | 0 | 0 | 0 |
| 24.07.2016 18:00 - 19:00 | 0 | 0 | 0 | 0 |
| 24.07.2016 19:00 - 20:00 | 0 | 0 | 0 | 0 |
| 24.07.2016 20:00 - 21:00 | 0 | 0 | 0 | 0 |
| 24.07.2016 21:00 - 22:00 | 0 | 0 | 0 | 0 |
| 24.07.2016 22:00 - 23:00 | 0 | 0 | 0 | 0 |
| 24.07.2016 23:00 - 24:00 | 0 | 0 | 0 | 0 |
| 25.07.2016 00:00 - 01:00 | 0 | 0 | 0 | 0 |
| 25.07.2016 01:00 - 02:00 | 0 | 0 | 0 | 0 |
| 25.07.2016 02:00 - 03:00 | 0 | 0 | 0 | 0 |
| 25.07.2016 03:00 - 04:00 | 0 | 0 | 0 | 0 |
| 25.07.2016 04:00 - 05:00 | 0 | 0 | 0 | 0 |
| 25.07.2016 05:00 - 06:00 | 0 | 0 | 0 | 0 |
| 25.07.2016 06:00 - 07:00 | 0 | 0 | 0 | 0 |
| 25.07.2016 07:00 - 08:00 | 0 | 0 | 0 | 0 |
| 25.07.2016 08:00 - 09:00 | 0 | 0 | 0 | 0 |
| 25.07.2016 09:00 - 10:00 | 0 | 0 | 0 | 0 |
| 25.07.2016 10:00 - 11:00 | 0 | 0 | 0 | 0 |
| 25.07.2016 11:00 - 12:00 | 0 | 0 | 0 | 0 |
| 25.07.2016 12:00 - 13:00 | 0 | 0 | 0 | 0 |
| 25.07.2016 13:00 - 14:00 | 0 | 0 | 0 | 0 |
| 25.07.2016 14:00 - 15:00 | 0 | 0 | 0 | 0 |
| 25.07.2016 15:00 - 16:00 | 0 | 0 | 0 | 0 |
| 25.07.2016 16:00 - 17:00 | 0 | 0 | 0 | 0 |
| 25.07.2016 17:00 - 18:00 | 0 | 0 | 0 | 0 |
| 25.07.2016 18:00 - 19:00 | 0 | 0 | 0 | 0 |
| 25.07.2016 19:00 - 20:00 | 0 | 0 | 0 | 0 |
| 25.07.2016 20:00 - 21:00 | 0 | 0 | 0 | 0 |
| 25.07.2016 21:00 - 22:00 | 0 | 0 | 0 | 0 |
| 25.07.2016 22:00 - 23:00 | 0 | 0 | 0 | 0 |
| 25.07.2016 23:00 - 24:00 | 0 | 0 | 0 | 0 |
| 26.07.2016 00:00 - 01:00 | 0 | 0 | 0 | 0 |
| 26.07.2016 01:00 - 02:00 | 0 | 0 | 0 | 0 |
| 26.07.2016 02:00 - 03:00 | 0 | -200 | 0 | 0 |
| 26.07.2016 03:00 - 04:00 | 0 | -200 | 0 | 0 |
| 26.07.2016 04:00 - 05:00 | 0 | -200 | 0 | 0 |
| 26.07.2016 05:00 - 06:00 | 0 | -200 | 0 | 0 |
| 26.07.2016 06:00 - 07:00 | 0 | 0 | 0 | 0 |
| 26.07.2016 07:00 - 08:00 | 0 | 0 | 0 | 0 |
| 26.07.2016 08:00 - 09:00 | 0 | 0 | 0 | 0 |
| 26.07.2016 09:00 - 10:00 | 0 | 0 | 0 | 0 |
| 26.07.2016 10:00 - 11:00 | 0 | 0 | 0 | 0 |
| 26.07.2016 11:00 - 12:00 | 0 | 0 | 0 | 0 |
| 26.07.2016 12:00 - 13:00 | 0 | 0 | 0 | 0 |
| 26.07.2016 13:00 - 14:00 | 0 | 0 | 0 | 0 |
| 26.07.2016 14:00 - 15:00 | 0 | 0 | 0 | 0 |
| 26.07.2016 15:00 - 16:00 | 0 | 0 | 0 | 0 |
| 26.07.2016 16:00 - 17:00 | 0 | 0 | 0 | 0 |
| 26.07.2016 17:00 - 18:00 | 0 | 0 | 0 | 0 |
| 26.07.2016 18:00 - 19:00 | 0 | 0 | 0 | 0 |
| 26.07.2016 19:00 - 20:00 | 0 | 0 | 0 | 0 |
| 26.07.2016 20:00 - 21:00 | 0 | 0 | 0 | 0 |
| 26.07.2016 21:00 - 22:00 | 0 | 0 | 0 | 0 |
| 26.07.2016 22:00 - 23:00 | 0 | 0 | 0 | 0 |
| 26.07.2016 23:00 - 24:00 | 0 | 0 | 0 | 0 |
| 27.07.2016 00:00 - 01:00 | 0 | 0 | 0 | 0 |
| 27.07.2016 01:00 - 02:00 | 0 | 0 | 0 | 0 |
| 27.07.2016 02:00 - 03:00 | 0 | 0 | 0 | 0 |
| 27.07.2016 03:00 - 04:00 | 0 | 0 | 0 | 0 |
| 27.07.2016 04:00 - 05:00 | 0 | 0 | 0 | 0 |
| 27.07.2016 05:00 - 06:00 | 0 | 0 | 0 | 0 |
| 27.07.2016 06:00 - 07:00 | 0 | 0 | 0 | 0 |
| 27.07.2016 07:00 - 08:00 | 0 | 0 | 0 | 0 |
| 27.07.2016 08:00 - 09:00 | 0 | 0 | 0 | 0 |
| 27.07.2016 09:00 - 10:00 | 0 | 0 | 0 | 0 |
| 27.07.2016 10:00 - 11:00 | 0 | 0 | 0 | 0 |
| 27.07.2016 11:00 - 12:00 | 0 | 0 | 0 | 0 |
| 27.07.2016 12:00 - 13:00 | 0 | 0 | 0 | 0 |
| 27.07.2016 13:00 - 14:00 | 0 | 0 | 0 | 0 |
| 27.07.2016 14:00 - 15:00 | 0 | 0 | 0 | 0 |
| 27.07.2016 15:00 - 16:00 | 0 | 0 | 0 | 0 |
| 27.07.2016 16:00 - 17:00 | 0 | 0 | 0 | 0 |
| 27.07.2016 17:00 - 18:00 | 0 | 0 | 0 | 0 |
| 27.07.2016 18:00 - 19:00 | 0 | 0 | 0 | 0 |
| 27.07.2016 19:00 - 20:00 | 0 | 0 | 0 | 0 |
| 27.07.2016 20:00 - 21:00 | 0 | 0 | 0 | 0 |
| 27.07.2016 21:00 - 22:00 | 0 | 0 | 0 | 0 |
| 27.07.2016 22:00 - 23:00 | 0 | -400 | 0 | 0 |
| 27.07.2016 23:00 - 24:00 | 0 | -400 | 0 | 0 |
| 28.07.2016 00:00 - 01:00 | 0 | -400 | 0 | 0 |
| 28.07.2016 01:00 - 02:00 | 0 | -400 | 0 | 0 |
| 28.07.2016 02:00 - 03:00 | 0 | -400 | 0 | 0 |
| 28.07.2016 03:00 - 04:00 | 0 | -400 | 0 | 0 |
| 28.07.2016 04:00 - 05:00 | 0 | -400 | 0 | 0 |
| 28.07.2016 05:00 - 06:00 | 0 | -400 | 0 | 0 |
| 28.07.2016 06:00 - 07:00 | 0 | 0 | 0 | 0 |
| 28.07.2016 07:00 - 08:00 | 0 | 0 | 0 | 0 |
| 28.07.2016 08:00 - 09:00 | 0 | 0 | 0 | 0 |
| 28.07.2016 09:00 - 10:00 | 0 | 0 | 0 | 0 |
| 28.07.2016 10:00 - 11:00 | 0 | 0 | 0 | 0 |
| 28.07.2016 11:00 - 12:00 | 0 | 0 | 0 | 0 |
| 28.07.2016 12:00 - 13:00 | 0 | 0 | 0 | 0 |
| 28.07.2016 13:00 - 14:00 | 0 | 0 | 0 | 0 |
| 28.07.2016 14:00 - 15:00 | 0 | 0 | 0 | 0 |
| 28.07.2016 15:00 - 16:00 | 0 | 0 | 0 | 0 |
| 28.07.2016 16:00 - 17:00 | 0 | 0 | 0 | 0 |
| 28.07.2016 17:00 - 18:00 | 0 | 0 | 0 | 0 |
| 28.07.2016 18:00 - 19:00 | 0 | 0 | 0 | 0 |
| 28.07.2016 19:00 - 20:00 | 0 | 0 | 0 | 0 |
| 28.07.2016 20:00 - 21:00 | 0 | 0 | 0 | 0 |
| 28.07.2016 21:00 - 22:00 | 0 | 0 | 0 | 0 |
| 28.07.2016 22:00 - 23:00 | 0 | -400 | 0 | 0 |
| 28.07.2016 23:00 - 24:00 | 0 | -400 | 0 | 0 |
| 29.07.2016 00:00 - 01:00 | 0 | -400 | 0 | 0 |
| 29.07.2016 01:00 - 02:00 | 0 | -400 | 0 | 0 |
| 29.07.2016 02:00 - 03:00 | 0 | -400 | 0 | 0 |
| 29.07.2016 03:00 - 04:00 | 0 | -400 | 0 | 0 |
| 29.07.2016 04:00 - 05:00 | 0 | -400 | 0 | 0 |
| 29.07.2016 05:00 - 06:00 | 0 | -400 | 0 | 0 |
| 29.07.2016 06:00 - 07:00 | 0 | 0 | 0 | 0 |
| 29.07.2016 07:00 - 08:00 | 0 | 0 | 0 | 0 |
| 29.07.2016 08:00 - 09:00 | 0 | 0 | 0 | 0 |
| 29.07.2016 09:00 - 10:00 | 0 | 0 | 0 | 0 |
| 29.07.2016 10:00 - 11:00 | 0 | 0 | 0 | 0 |
| 29.07.2016 11:00 - 12:00 | 0 | 0 | 0 | 0 |
| 29.07.2016 12:00 - 13:00 | 0 | 0 | 0 | 0 |
| 29.07.2016 13:00 - 14:00 | 0 | 0 | 0 | 0 |
| 29.07.2016 14:00 - 15:00 | 0 | 0 | 0 | 0 |
| 29.07.2016 15:00 - 16:00 | 0 | 0 | 0 | 0 |
| 29.07.2016 16:00 - 17:00 | 0 | 0 | 0 | 0 |
| 29.07.2016 17:00 - 18:00 | 0 | 0 | 0 | 0 |
| 29.07.2016 18:00 - 19:00 | 0 | 0 | 0 | 0 |
| 29.07.2016 19:00 - 20:00 | 0 | 0 | 0 | 0 |
| 29.07.2016 20:00 - 21:00 | 0 | 0 | 0 | 0 |
| 29.07.2016 21:00 - 22:00 | 0 | 0 | 0 | 0 |
| 29.07.2016 22:00 - 23:00 | 0 | 0 | 0 | 0 |
| 29.07.2016 23:00 - 24:00 | 0 | 0 | 0 | 0 |
| 30.07.2016 00:00 - 01:00 | 0 | 0 | 0 | 0 |
| 30.07.2016 01:00 - 02:00 | 0 | 0 | 0 | 0 |
| 30.07.2016 02:00 - 03:00 | 0 | 0 | 0 | 0 |
| 30.07.2016 03:00 - 04:00 | 0 | 0 | 0 | 0 |
| 30.07.2016 04:00 - 05:00 | 0 | 0 | 0 | 0 |
| 30.07.2016 05:00 - 06:00 | 0 | 0 | 0 | 0 |
| 30.07.2016 06:00 - 07:00 | 0 | 0 | 0 | 0 |
| 30.07.2016 07:00 - 08:00 | 0 | 0 | 0 | 0 |
| 30.07.2016 08:00 - 09:00 | 0 | 0 | 0 | 0 |
| 30.07.2016 09:00 - 10:00 | 0 | 0 | 0 | 0 |
| 30.07.2016 10:00 - 11:00 | 0 | 0 | 0 | 0 |
| 30.07.2016 11:00 - 12:00 | 0 | 0 | 0 | 0 |
| 30.07.2016 12:00 - 13:00 | 0 | 0 | 0 | 0 |
| 30.07.2016 13:00 - 14:00 | 0 | 0 | 0 | 0 |
| 30.07.2016 14:00 - 15:00 | 0 | 0 | 0 | 0 |
| 30.07.2016 15:00 - 16:00 | 0 | 0 | 0 | 0 |
| 30.07.2016 16:00 - 17:00 | 0 | 0 | 0 | 0 |
| 30.07.2016 17:00 - 18:00 | 0 | 0 | 0 | 0 |
| 30.07.2016 18:00 - 19:00 | 0 | 0 | 0 | 0 |
| 30.07.2016 19:00 - 20:00 | 0 | 0 | 0 | 0 |
| 30.07.2016 20:00 - 21:00 | 0 | 0 | 0 | 0 |
| 30.07.2016 21:00 - 22:00 | 0 | 0 | 0 | 0 |
| 30.07.2016 22:00 - 23:00 | 0 | 0 | 0 | 0 |
| 30.07.2016 23:00 - 24:00 | 0 | 0 | 0 | 0 |
| 31.07.2016 00:00 - 01:00 | 0 | 0 | 0 | 0 |
| 31.07.2016 01:00 - 02:00 | 0 | 0 | 0 | 0 |
| 31.07.2016 02:00 - 03:00 | 0 | 0 | 0 | 0 |
| 31.07.2016 03:00 - 04:00 | 0 | 0 | 0 | 0 |
| 31.07.2016 04:00 - 05:00 | 0 | 0 | 0 | 0 |
| 31.07.2016 05:00 - 06:00 | 0 | 0 | 0 | 0 |
| 31.07.2016 06:00 - 07:00 | 0 | 0 | 0 | 0 |
| 31.07.2016 07:00 - 08:00 | 0 | 0 | 0 | 0 |
| 31.07.2016 08:00 - 09:00 | 0 | 0 | 0 | 0 |
| 31.07.2016 09:00 - 10:00 | 0 | 0 | 0 | 0 |
| 31.07.2016 10:00 - 11:00 | 0 | 0 | 0 | 0 |
| 31.07.2016 11:00 - 12:00 | 0 | 0 | 0 | 0 |
| 31.07.2016 12:00 - 13:00 | 0 | 0 | 0 | 0 |
| 31.07.2016 13:00 - 14:00 | 0 | 0 | 0 | 0 |
| 31.07.2016 14:00 - 15:00 | 0 | 0 | 0 | 0 |
| 31.07.2016 15:00 - 16:00 | 0 | 0 | 0 | 0 |
| 31.07.2016 16:00 - 17:00 | 0 | 0 | 0 | 0 |
| 31.07.2016 17:00 - 18:00 | 0 | 0 | 0 | 0 |
| 31.07.2016 18:00 - 19:00 | 0 | 0 | 0 | 0 |
| 31.07.2016 19:00 - 20:00 | 0 | 0 | 0 | 0 |
| 31.07.2016 20:00 - 21:00 | 0 | 0 | 0 | 0 |
| 31.07.2016 21:00 - 22:00 | 0 | 0 | 0 | 0 |
| 31.07.2016 22:00 - 23:00 | 0 | 0 | 0 | 0 |
| 31.07.2016 23:00 - 24:00 | 0 | 0 | 0 | 0 |
| 01.08.2016 00:00 - 01:00 | 0 | 0 | 0 | 0 |
| 01.08.2016 01:00 - 02:00 | 0 | 0 | 0 | 0 |
| 01.08.2016 02:00 - 03:00 | 0 | 0 | 0 | 0 |
| 01.08.2016 03:00 - 04:00 | 0 | 0 | 0 | 0 |
| 01.08.2016 04:00 - 05:00 | 0 | 0 | 0 | 0 |
| 01.08.2016 05:00 - 06:00 | 0 | 0 | 0 | 0 |